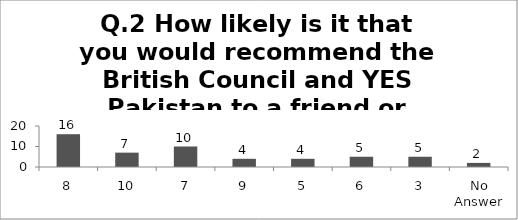
| Category | Q.2 How likely is it that you would recommend the British Council and YES Pakistan to a friend or colleague?  |
|---|---|
| 8 | 16 |
| 10 | 7 |
| 7 | 10 |
| 9 | 4 |
| 5 | 4 |
| 6 | 5 |
| 3 | 5 |
| No Answer | 2 |